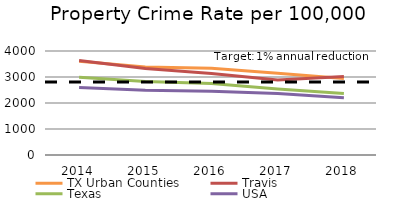
| Category | TX Urban Counties | Travis  | Texas | USA |
|---|---|---|---|---|
| 2014.0 | 3607.784 | 3630.894 | 2987.922 | 2596.094 |
| 2015.0 | 3382.503 | 3329.093 | 2822.778 | 2486.983 |
| 2016.0 | 3337.497 | 3138.737 | 2751.583 | 2448.636 |
| 2017.0 | 3144.732 | 2884.651 | 2539.672 | 2366.34 |
| 2018.0 | 2943.43 | 3022.932 | 2363.162 | 2199.499 |